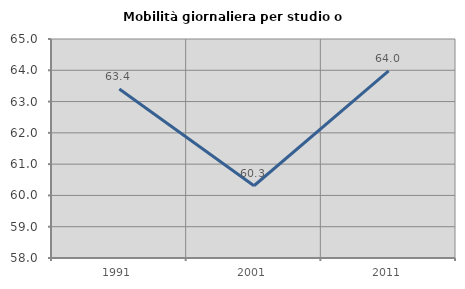
| Category | Mobilità giornaliera per studio o lavoro |
|---|---|
| 1991.0 | 63.404 |
| 2001.0 | 60.309 |
| 2011.0 | 63.981 |